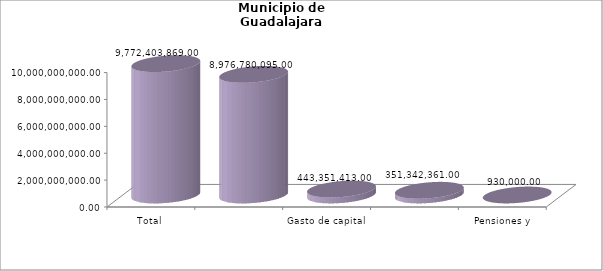
| Category | Municipio de Guadalajara
Tipo de Gasto de los ejercicios fiscales 2017-2022 |
|---|---|
| Total | 9772403869 |
| Gasto corriente | 8976780095 |
| Gasto de capital | 443351413 |
| Amortización de la deuda y disminución de pasivos | 351342361 |
| Pensiones y Jubilaciones | 930000 |